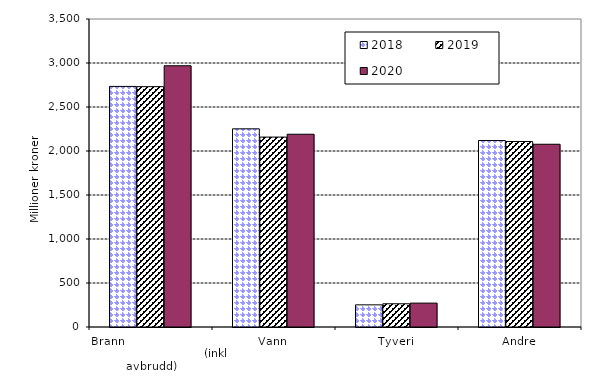
| Category | 2018 | 2019 | 2020 |
|---|---|---|---|
| Brann                                                       (inkl avbrudd) | 2733.966 | 2731.245 | 2968.734 |
| Vann | 2251.792 | 2158.059 | 2190.373 |
| Tyveri | 251.618 | 263.975 | 271.443 |
| Andre | 2119.387 | 2107.771 | 2076.654 |